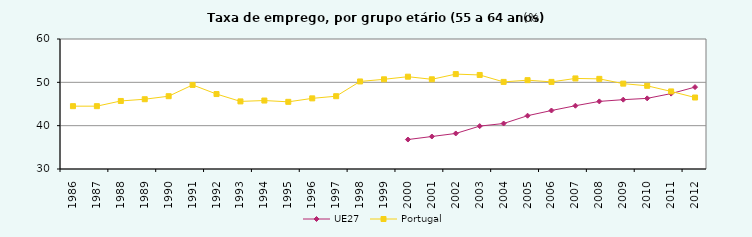
| Category | UE27 | Portugal |
|---|---|---|
| 1986 | 0 | 44.5 |
| 1987 | 0 | 44.5 |
| 1988 | 0 | 45.7 |
| 1989 | 0 | 46.1 |
| 1990 | 0 | 46.8 |
| 1991 | 0 | 49.4 |
| 1992 | 0 | 47.3 |
| 1993 | 0 | 45.6 |
| 1994 | 0 | 45.8 |
| 1995 | 0 | 45.5 |
| 1996 | 0 | 46.3 |
| 1997 | 0 | 46.8 |
| 1998 | 0 | 50.2 |
| 1999 | 0 | 50.7 |
| 2000 | 36.8 | 51.3 |
| 2001 | 37.5 | 50.7 |
| 2002 | 38.2 | 51.9 |
| 2003 | 39.9 | 51.7 |
| 2004 | 40.5 | 50.1 |
| 2005 | 42.3 | 50.5 |
| 2006 | 43.5 | 50.1 |
| 2007 | 44.6 | 50.9 |
| 2008 | 45.6 | 50.8 |
| 2009 | 46 | 49.7 |
| 2010 | 46.3 | 49.2 |
| 2011 | 47.4 | 47.9 |
| 2012 | 48.9 | 46.5 |